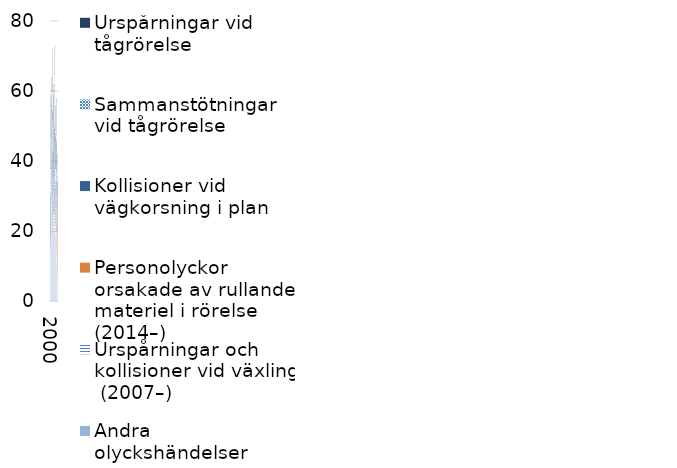
| Category | Andra olyckshändelser | Urspårningar och kollisioner vid växling  (2007–) | Personolyckor orsakade av rullande materiel i rörelse (2014–) | Kollisioner vid vägkorsning i plan | Sammanstötningar vid tågrörelse  | Urspårningar vid tågrörelse  |
|---|---|---|---|---|---|---|
| 2000 | 15 | 0 | 0 | 12 | 1 | 2 |
| 2001 | 19 | 0 | 0 | 12 | 7 | 21 |
| 2002 | 30 | 0 | 0 | 10 | 7 | 9 |
| 2003 | 38 | 0 | 0 | 10 | 8 | 8 |
| 2004 | 36 | 0 | 0 | 19 | 5 | 12 |
| 2005 | 22 | 0 | 0 | 21 | 9 | 2 |
| 2006 | 25 | 0 | 0 | 18 | 7 | 12 |
| 2007 | 26 | 6 | 0 | 15 | 1 | 11 |
| 2008 | 20 | 6 | 0 | 6 | 4 | 14 |
| 2009 | 21 | 4 | 0 | 16 | 1 | 7 |
| 2010 | 41 | 5 | 0 | 16 | 3 | 8 |
| 2011 | 32 | 6 | 0 | 9 | 2 | 7 |
| 2012 | 18 | 4 | 0 | 12 | 4 | 10 |
| 2013 | 19 | 1 | 0 | 14 | 3 | 9 |
| 2014 | 9 | 5 | 19 | 11 | 4 | 10 |
| 2015 | 2 | 7 | 18 | 9 | 3 | 3 |
| 2016 | 4 | 1 | 16 | 7 | 2 | 4 |